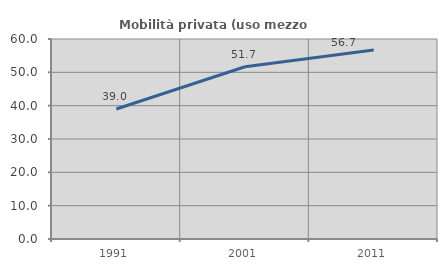
| Category | Mobilità privata (uso mezzo privato) |
|---|---|
| 1991.0 | 39.011 |
| 2001.0 | 51.66 |
| 2011.0 | 56.729 |